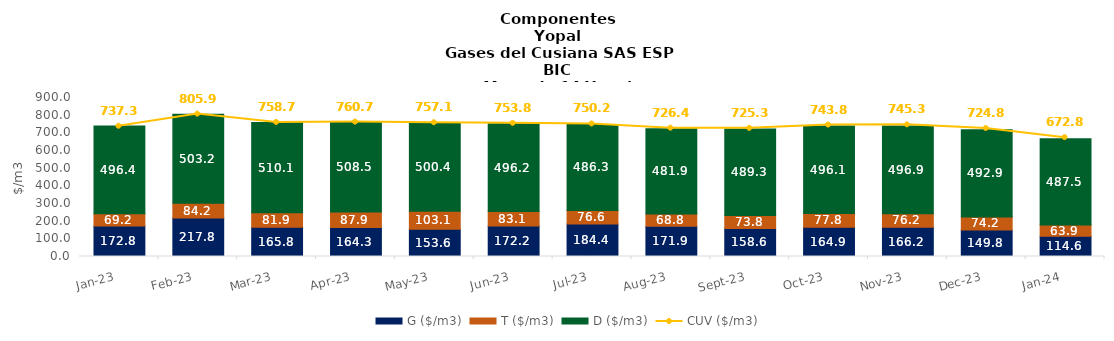
| Category | G ($/m3) | T ($/m3) | D ($/m3) |
|---|---|---|---|
| 2023-01-01 | 172.82 | 69.18 | 496.38 |
| 2023-02-01 | 217.82 | 84.19 | 503.15 |
| 2023-03-01 | 165.84 | 81.88 | 510.12 |
| 2023-04-01 | 164.25 | 87.89 | 508.45 |
| 2023-05-01 | 153.57 | 103.08 | 500.4 |
| 2023-06-01 | 172.16 | 83.07 | 496.23 |
| 2023-07-01 | 184.42 | 76.55 | 486.26 |
| 2023-08-01 | 171.91 | 68.78 | 481.89 |
| 2023-09-01 | 158.55 | 73.83 | 489.25 |
| 2023-10-01 | 164.94 | 77.79 | 496.13 |
| 2023-11-01 | 166.18 | 76.24 | 496.87 |
| 2023-12-01 | 149.82 | 74.15 | 492.91 |
| 2024-01-01 | 114.55 | 63.9 | 487.46 |